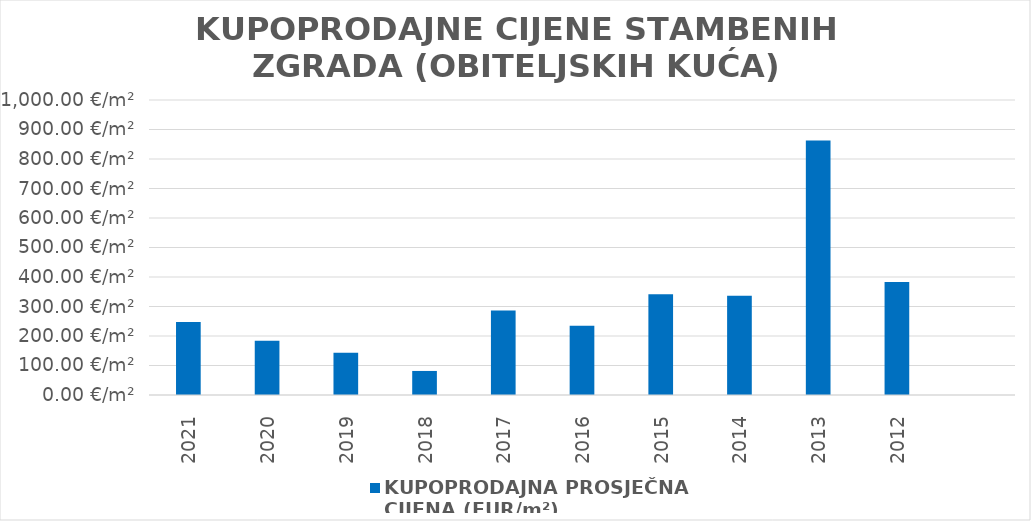
| Category | KUPOPRODAJNA PROSJEČNA 
CIJENA (EUR/m²) |
|---|---|
| 2021 | 1900-09-03 05:07:50 |
| 2020 | 1900-07-02 01:27:35 |
| 2019 | 1900-05-22 04:11:45 |
| 2018 | 1900-03-21 12:24:35 |
| 2017 | 1900-10-12 12:12:40 |
| 2016 | 1900-08-21 20:47:07 |
| 2015 | 1900-12-06 05:47:21 |
| 2014 | 1900-12-01 15:12:01 |
| 2013 | 1902-05-11 13:51:15 |
| 2012 | 1901-01-16 21:31:09 |